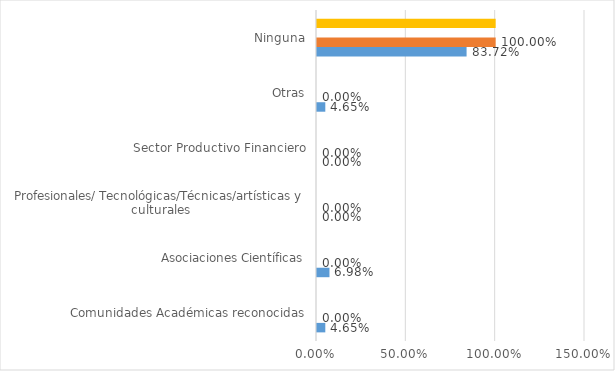
| Category | Series 0 | Series 1 | Series 2 | Series 3 |
|---|---|---|---|---|
| Comunidades Académicas reconocidas | 0.047 | 0 | 0 | 0 |
| Asociaciones Científicas | 0.07 | 0 | 0 | 0 |
| Profesionales/ Tecnológicas/Técnicas/artísticas y culturales | 0 | 0 | 0 | 0 |
| Sector Productivo Financiero | 0 | 0 | 0 | 0 |
| Otras | 0.047 | 0 | 0 | 0 |
| Ninguna | 0.837 | 1 | 0 | 1 |